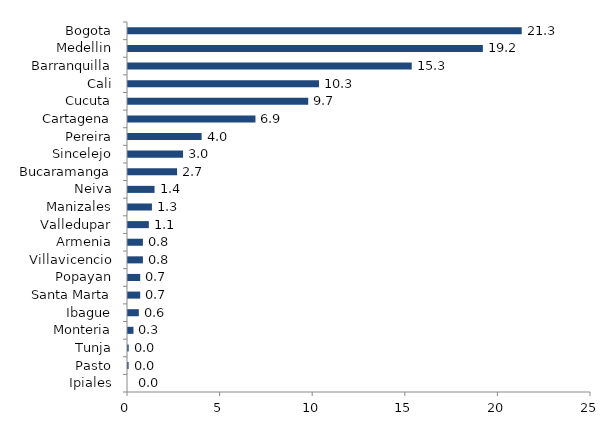
| Category | Series 0 |
|---|---|
| Ipiales | 0 |
| Pasto | 0.034 |
| Tunja | 0.037 |
| Monteria | 0.295 |
| Ibague | 0.585 |
| Santa Marta | 0.659 |
| Popayan | 0.659 |
| Villavicencio | 0.806 |
| Armenia | 0.807 |
| Valledupar | 1.125 |
| Manizales | 1.293 |
| Neiva | 1.433 |
| Bucaramanga | 2.65 |
| Sincelejo | 2.974 |
| Pereira | 3.976 |
| Cartagena | 6.882 |
| Cucuta | 9.731 |
| Cali | 10.311 |
| Barranquilla | 15.321 |
| Medellin | 19.162 |
| Bogota | 21.258 |